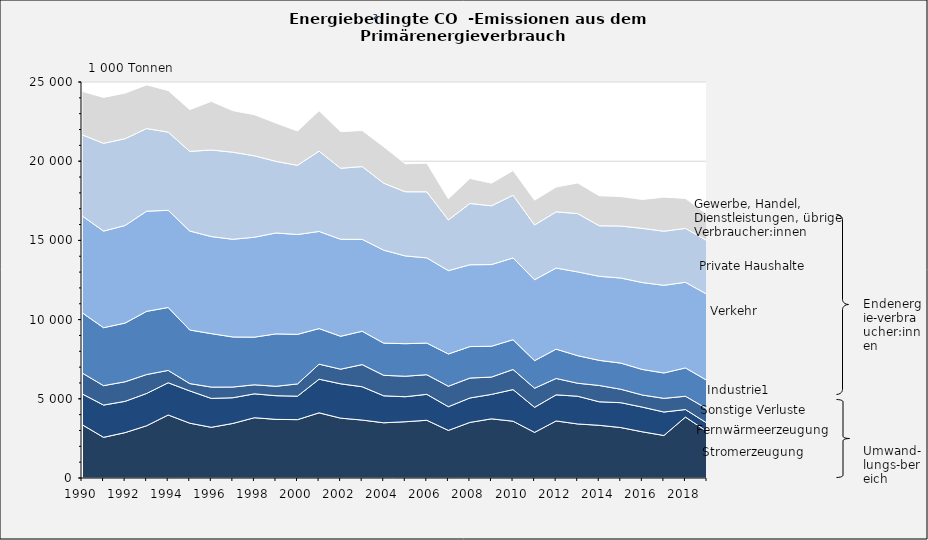
| Category | Stromerzeugung | Fernwärmeerzeugung | Sonstige Verluste | Industrie1 | Verkehr | Private Haushalte | Gewerbe, Handel, Dienstleistungen, übrige Verbraucher:innen |
|---|---|---|---|---|---|---|---|
| 1990.0 | 3371.486 | 1943.547 | 1320.394 | 3804.727 | 6112.816 | 5116.565 | 2742.045 |
| 1991.0 | 2567.638 | 2036.341 | 1227.548 | 3657.508 | 6098.15 | 5539.379 | 2901.175 |
| 1992.0 | 2865.272 | 1974.446 | 1236.431 | 3705.024 | 6162.39 | 5476.347 | 2877.899 |
| 1993.0 | 3299.486 | 2038.85 | 1193.324 | 3989.26 | 6324.022 | 5217.371 | 2755.161 |
| 1994.0 | 3978.563 | 2034.488 | 780.207 | 3971.838 | 6134.103 | 4934.446 | 2627.258 |
| 1995.0 | 3461.174 | 2037.907 | 461.206 | 3383.339 | 6249.129 | 5026.487 | 2634.874 |
| 1996.0 | 3200.925 | 1824.56 | 714.035 | 3374.85 | 6128.805 | 5465.821 | 3070.011 |
| 1997.0 | 3444.901 | 1621.57 | 676.661 | 3159.924 | 6166.729 | 5497.646 | 2622.821 |
| 1998.0 | 3806.562 | 1507.285 | 570.944 | 3008.594 | 6306.922 | 5139.531 | 2595.114 |
| 1999.0 | 3701.846 | 1494.129 | 593.502 | 3308.974 | 6370.874 | 4520.523 | 2415.679 |
| 2000.0 | 3684.83 | 1480.565 | 774.837 | 3128.248 | 6304.226 | 4368.588 | 2165.202 |
| 2001.0 | 4114.152 | 2123.547 | 949.324 | 2245.338 | 6132.787 | 5069.669 | 2550.382 |
| 2002.0 | 3778.969 | 2167.503 | 924.024 | 2075.858 | 6126.35 | 4482.009 | 2311.335 |
| 2003.0 | 3657.903 | 2103.241 | 1397.822 | 2106.054 | 5801.612 | 4594.38 | 2274.209 |
| 2004.0 | 3486.007 | 1703.968 | 1293.687 | 2030.891 | 5867.799 | 4227.637 | 2303.604 |
| 2005.0 | 3552.044 | 1578.614 | 1294.132 | 2054.86 | 5540.796 | 4050.809 | 1764.411 |
| 2006.0 | 3643.907 | 1638.247 | 1238.972 | 1997.205 | 5378.38 | 4170.409 | 1805.938 |
| 2007.0 | 3004.687 | 1496.461 | 1292.318 | 2035.318 | 5262.188 | 3199.223 | 1336.259 |
| 2008.0 | 3509.988 | 1542.883 | 1256.852 | 1988.054 | 5164.237 | 3870.983 | 1578.564 |
| 2009.0 | 3734.75 | 1542.786 | 1095.011 | 1945.8 | 5155.296 | 3709.951 | 1429.667 |
| 2010.0 | 3585.919 | 1996.268 | 1267.868 | 1881.478 | 5162.522 | 3959.148 | 1558.676 |
| 2011.0 | 2879.738 | 1581.922 | 1206.749 | 1739.39 | 5109.738 | 3457.373 | 1565.613 |
| 2012.0 | 3601.462 | 1648.576 | 1033.744 | 1851.217 | 5118.803 | 3548.876 | 1562.921 |
| 2013.0 | 3411.194 | 1751.155 | 819.848 | 1739.787 | 5290.308 | 3681.455 | 1930.714 |
| 2014.0 | 3327.141 | 1483.993 | 1029.947 | 1584.828 | 5308.429 | 3189.364 | 1894.706 |
| 2015.0 | 3184.54 | 1570.25 | 847.294 | 1651.277 | 5371.008 | 3281.79 | 1864.106 |
| 2016.0 | 2916.005 | 1558.909 | 764.577 | 1612.66 | 5488.009 | 3420.129 | 1822.097 |
| 2017.0 | 2683.979 | 1481.155 | 862.72 | 1603.128 | 5535.211 | 3413.039 | 2152.072 |
| 2018.0 | 3845.35 | 476.238 | 839.922 | 1787.701 | 5406.358 | 3403.149 | 1892.334 |
| 2019.0 | 2936.723 | 528.538 | 907.178 | 1789.053 | 5440.168 | 3384.399 | 1659.806 |